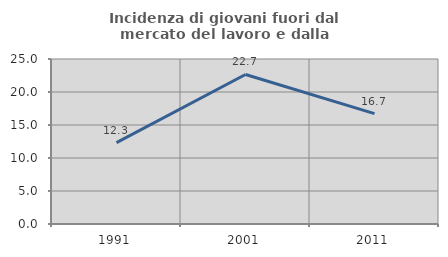
| Category | Incidenza di giovani fuori dal mercato del lavoro e dalla formazione  |
|---|---|
| 1991.0 | 12.322 |
| 2001.0 | 22.652 |
| 2011.0 | 16.714 |